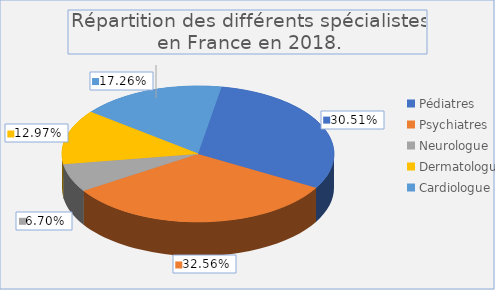
| Category | 2018 | 2017 |
|---|---|---|
| Pédiatres | 1612 | 1589 |
| Psychiatres | 1720 | 1645 |
| Neurologue | 354 | 312 |
| Dermatologue | 685 | 662 |
| Cardiologue | 912 | 795 |